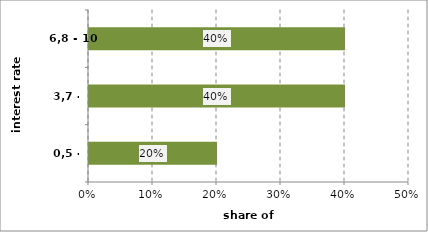
| Category | Series 0 |
|---|---|
| 0,5 - 3,7 | 0.2 |
| 3,7 - 6,8 | 0.4 |
| 6,8 - 10 | 0.4 |